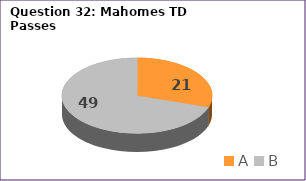
| Category | Series 0 |
|---|---|
| A | 21 |
| B | 49 |